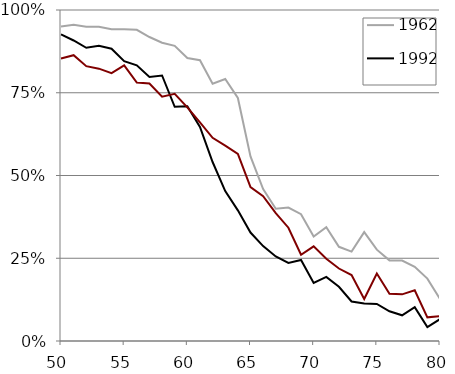
| Category | 1962 | 1992 | 2021 |
|---|---|---|---|
| 50.0 | 0.951 | 0.927 | 0.854 |
| 51.0 | 0.955 | 0.908 | 0.863 |
| 52.0 | 0.949 | 0.886 | 0.83 |
| 53.0 | 0.949 | 0.892 | 0.823 |
| 54.0 | 0.942 | 0.883 | 0.809 |
| 55.0 | 0.942 | 0.845 | 0.833 |
| 56.0 | 0.94 | 0.833 | 0.781 |
| 57.0 | 0.918 | 0.797 | 0.778 |
| 58.0 | 0.901 | 0.802 | 0.738 |
| 59.0 | 0.892 | 0.708 | 0.747 |
| 60.0 | 0.855 | 0.709 | 0.706 |
| 61.0 | 0.848 | 0.646 | 0.66 |
| 62.0 | 0.777 | 0.541 | 0.614 |
| 63.0 | 0.791 | 0.453 | 0.59 |
| 64.0 | 0.734 | 0.395 | 0.565 |
| 65.0 | 0.558 | 0.328 | 0.465 |
| 66.0 | 0.459 | 0.287 | 0.438 |
| 67.0 | 0.4 | 0.255 | 0.386 |
| 68.0 | 0.403 | 0.236 | 0.342 |
| 69.0 | 0.383 | 0.245 | 0.26 |
| 70.0 | 0.315 | 0.175 | 0.286 |
| 71.0 | 0.343 | 0.194 | 0.249 |
| 72.0 | 0.285 | 0.164 | 0.219 |
| 73.0 | 0.27 | 0.119 | 0.199 |
| 74.0 | 0.329 | 0.113 | 0.127 |
| 75.0 | 0.276 | 0.112 | 0.204 |
| 76.0 | 0.244 | 0.09 | 0.143 |
| 77.0 | 0.243 | 0.078 | 0.141 |
| 78.0 | 0.224 | 0.102 | 0.153 |
| 79.0 | 0.188 | 0.042 | 0.072 |
| 80.0 | 0.127 | 0.066 | 0.075 |